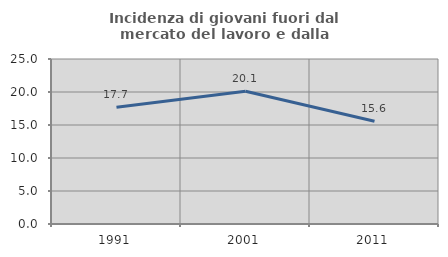
| Category | Incidenza di giovani fuori dal mercato del lavoro e dalla formazione  |
|---|---|
| 1991.0 | 17.706 |
| 2001.0 | 20.12 |
| 2011.0 | 15.558 |